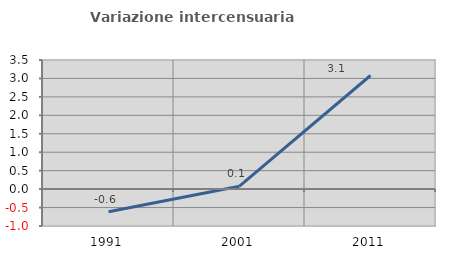
| Category | Variazione intercensuaria annua |
|---|---|
| 1991.0 | -0.614 |
| 2001.0 | 0.079 |
| 2011.0 | 3.08 |